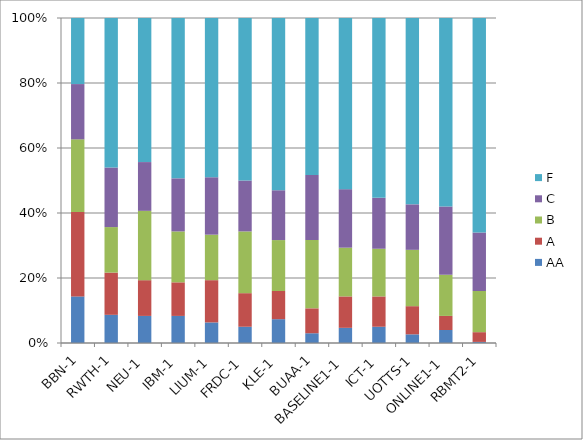
| Category | AA | A | B | C | F |
|---|---|---|---|---|---|
| BBN-1 | 43 | 78 | 67 | 51 | 61 |
| RWTH-1 | 26 | 39 | 42 | 55 | 138 |
| NEU-1 | 25 | 33 | 64 | 45 | 133 |
| IBM-1 | 25 | 31 | 47 | 49 | 148 |
| LIUM-1 | 19 | 39 | 42 | 53 | 147 |
| FRDC-1 | 15 | 31 | 57 | 47 | 150 |
| KLE-1 | 22 | 26 | 47 | 46 | 159 |
| BUAA-1 | 9 | 23 | 63 | 60 | 145 |
| BASELINE1-1 | 14 | 29 | 45 | 54 | 158 |
| ICT-1 | 15 | 28 | 44 | 47 | 166 |
| UOTTS-1 | 8 | 26 | 52 | 42 | 172 |
| ONLINE1-1 | 12 | 13 | 38 | 63 | 174 |
| RBMT2-1 | 1 | 9 | 38 | 54 | 198 |